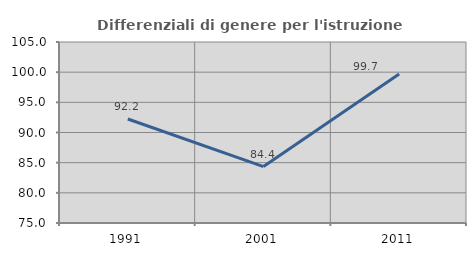
| Category | Differenziali di genere per l'istruzione superiore |
|---|---|
| 1991.0 | 92.231 |
| 2001.0 | 84.351 |
| 2011.0 | 99.7 |